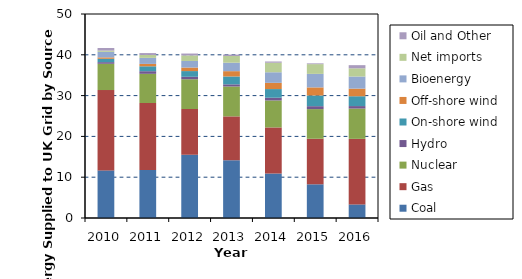
| Category | Coal | Gas | Nuclear | Hydro | On-shore wind | Off-shore wind | Bioenergy | Net imports | Oil and Other |
|---|---|---|---|---|---|---|---|---|---|
| 2010.0 | 11.67 | 19.69 | 6.44 | 0.4 | 0.82 | 0.35 | 1.36 | 0.3 | 0.64 |
| 2011.0 | 11.77 | 16.42 | 7.15 | 0.64 | 1.2 | 0.59 | 1.48 | 0.71 | 0.46 |
| 2012.0 | 15.5 | 11.21 | 7.3 | 0.6 | 1.4 | 0.87 | 1.61 | 1.36 | 0.459 |
| 2013.0 | 14.16 | 10.75 | 7.32 | 0.53 | 1.93 | 1.3 | 2.07 | 1.65 | 0.34 |
| 2014.0 | 10.9 | 11.3 | 6.61 | 0.67 | 2.12 | 1.53 | 2.59 | 2.34 | 0.298 |
| 2015.0 | 8.259 | 11.16 | 7.273 | 0.715 | 2.62 | 1.986 | 3.31 | 2.39 | 0.187 |
| 2016.0 | 3.324 | 16.067 | 7.432 | 0.61 | 2.406 | 1.872 | 2.968 | 2.002 | 0.779 |